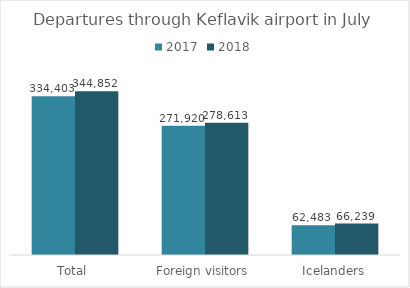
| Category | 2017 | 2018 |
|---|---|---|
| Total | 334403 | 344852 |
| Foreign visitors | 271920 | 278613 |
| Icelanders | 62483 | 66239 |